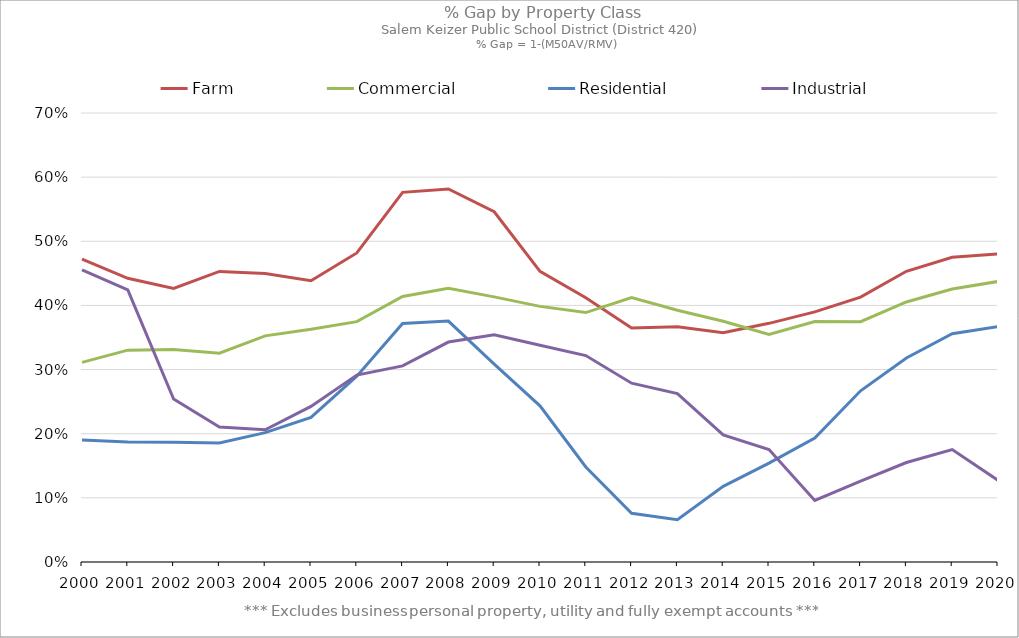
| Category | Farm | Commercial | Residential | Industrial |
|---|---|---|---|---|
| 2000.0 | 0.472 | 0.311 | 0.19 | 0.455 |
| 2001.0 | 0.442 | 0.33 | 0.187 | 0.424 |
| 2002.0 | 0.426 | 0.331 | 0.187 | 0.254 |
| 2003.0 | 0.453 | 0.326 | 0.186 | 0.21 |
| 2004.0 | 0.45 | 0.353 | 0.202 | 0.206 |
| 2005.0 | 0.438 | 0.363 | 0.225 | 0.243 |
| 2006.0 | 0.482 | 0.375 | 0.29 | 0.291 |
| 2007.0 | 0.576 | 0.414 | 0.372 | 0.306 |
| 2008.0 | 0.582 | 0.427 | 0.376 | 0.343 |
| 2009.0 | 0.546 | 0.413 | 0.309 | 0.354 |
| 2010.0 | 0.453 | 0.399 | 0.244 | 0.338 |
| 2011.0 | 0.412 | 0.389 | 0.148 | 0.322 |
| 2012.0 | 0.365 | 0.412 | 0.076 | 0.279 |
| 2013.0 | 0.367 | 0.392 | 0.066 | 0.263 |
| 2014.0 | 0.358 | 0.375 | 0.118 | 0.198 |
| 2015.0 | 0.372 | 0.355 | 0.154 | 0.175 |
| 2016.0 | 0.39 | 0.375 | 0.193 | 0.096 |
| 2017.0 | 0.413 | 0.375 | 0.267 | 0.126 |
| 2018.0 | 0.453 | 0.405 | 0.318 | 0.155 |
| 2019.0 | 0.475 | 0.425 | 0.356 | 0.175 |
| 2020.0 | 0.48 | 0.437 | 0.367 | 0.127 |